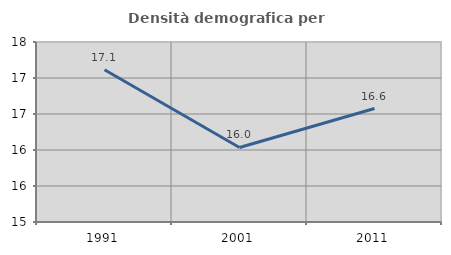
| Category | Densità demografica |
|---|---|
| 1991.0 | 17.114 |
| 2001.0 | 16.035 |
| 2011.0 | 16.576 |